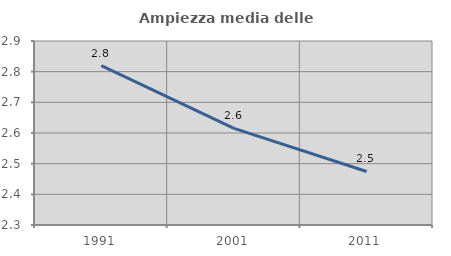
| Category | Ampiezza media delle famiglie |
|---|---|
| 1991.0 | 2.82 |
| 2001.0 | 2.615 |
| 2011.0 | 2.475 |